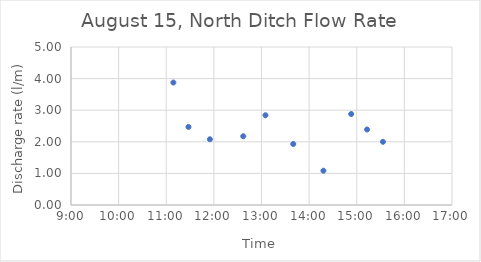
| Category | Series 0 |
|---|---|
| 0.46458333333333335 | 3.875 |
| 0.4777777777777778 | 2.471 |
| 0.49652777777777773 | 2.08 |
| 0.5256944444444445 | 2.175 |
| 0.545138888888889 | 2.84 |
| 0.5694444444444444 | 1.93 |
| 0.5958333333333333 | 1.086 |
| 0.6201388888888889 | 2.879 |
| 0.6340277777777777 | 2.389 |
| 0.6479166666666667 | 2 |